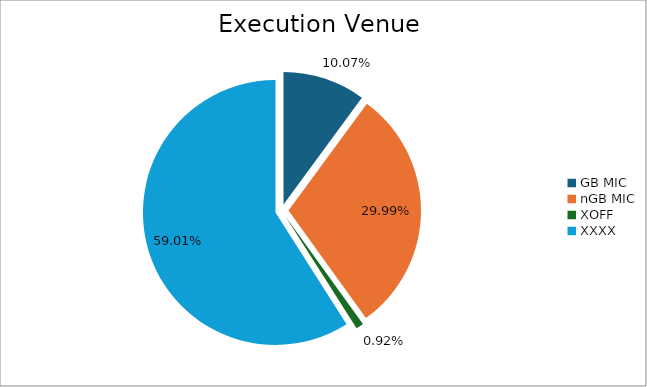
| Category | Series 0 |
|---|---|
| GB MIC | 961145.204 |
| nGB MIC | 2861726.148 |
| XOFF | 88223.986 |
| XXXX | 5630137.877 |